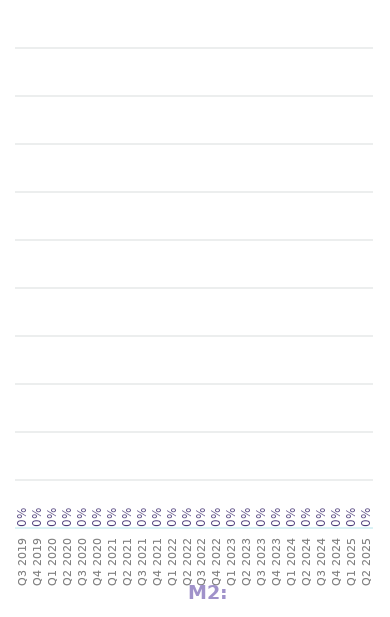
| Category | Series 0 |
|---|---|
| Q3 2019 | 0 |
| Q4 2019 | 0 |
| Q1 2020 | 0 |
| Q2 2020 | 0 |
| Q3 2020 | 0 |
| Q4 2020 | 0 |
| Q1 2021 | 0 |
| Q2 2021 | 0 |
| Q3 2021 | 0 |
| Q4 2021 | 0 |
| Q1 2022 | 0 |
| Q2 2022 | 0 |
| Q3 2022 | 0 |
| Q4 2022 | 0 |
| Q1 2023 | 0 |
| Q2 2023 | 0 |
| Q3 2023 | 0 |
| Q4 2023 | 0 |
| Q1 2024 | 0 |
| Q2 2024 | 0 |
| Q3 2024 | 0 |
| Q4 2024 | 0 |
| Q1 2025 | 0 |
| Q2 2025 | 0 |